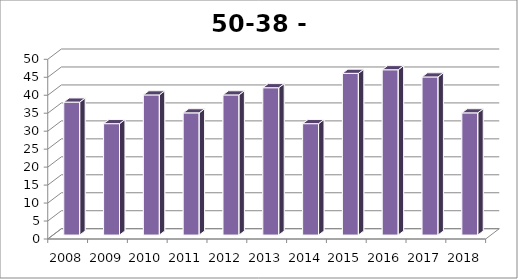
| Category | Hilvarenbeek |
|---|---|
| 2008.0 | 37 |
| 2009.0 | 31 |
| 2010.0 | 39 |
| 2011.0 | 34 |
| 2012.0 | 39 |
| 2013.0 | 41 |
| 2014.0 | 31 |
| 2015.0 | 45 |
| 2016.0 | 46 |
| 2017.0 | 44 |
| 2018.0 | 34 |